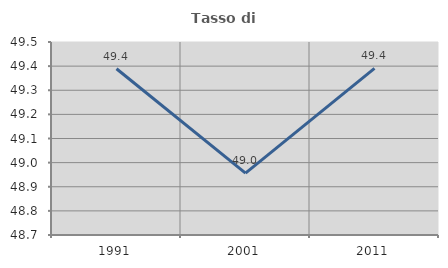
| Category | Tasso di occupazione   |
|---|---|
| 1991.0 | 49.389 |
| 2001.0 | 48.956 |
| 2011.0 | 49.391 |